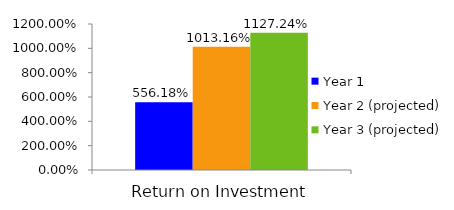
| Category | Year 1 | Year 2 (projected) | Year 3 (projected) |
|---|---|---|---|
| 0 | 5.562 | 10.132 | 11.272 |